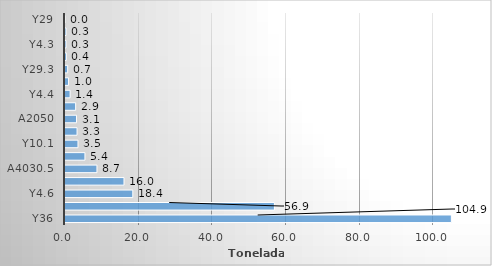
| Category | Series 0 |
|---|---|
| Y36 | 104.94 |
| A1180 | 56.879 |
| Y4.6 | 18.415 |
| Y29.2 | 16.021 |
| A4030.5 | 8.68 |
| Y4.5 | 5.419 |
| Y10.1 | 3.526 |
| Y4.2 | 3.275 |
| A2050 | 3.135 |
| Y4.1 | 2.896 |
| Y4.4 | 1.39 |
| Y29.1 | 0.964 |
| Y29.3 | 0.725 |
| Y10.5 | 0.38 |
| Y4.3 | 0.3 |
| A4030.1 | 0.297 |
| Y29 | 0.004 |